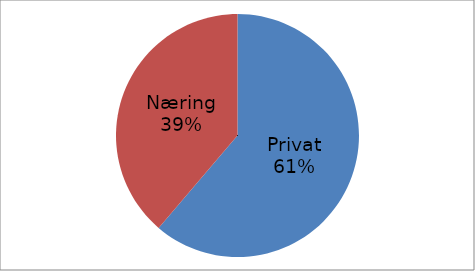
| Category | Series 0 |
|---|---|
| Privat | 51292666 |
| Næring | 32459869 |